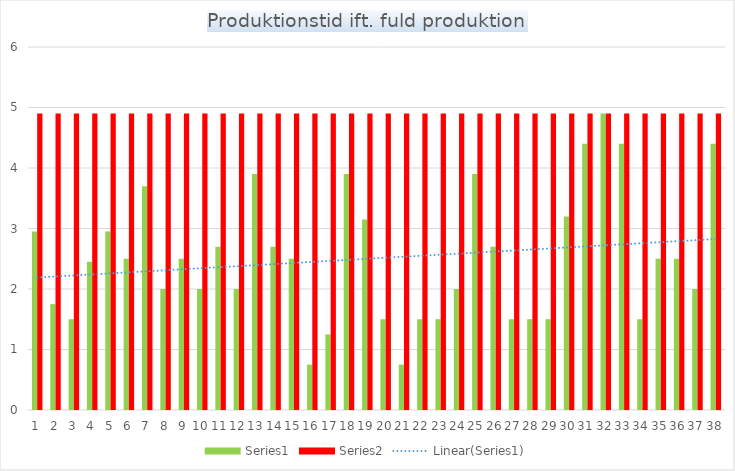
| Category | Series 0 | Series 1 |
|---|---|---|
| 0 | 2.95 | 4.9 |
| 1 | 1.75 | 4.9 |
| 2 | 1.5 | 4.9 |
| 3 | 2.45 | 4.9 |
| 4 | 2.95 | 4.9 |
| 5 | 2.5 | 4.9 |
| 6 | 3.7 | 4.9 |
| 7 | 2 | 4.9 |
| 8 | 2.5 | 4.9 |
| 9 | 2 | 4.9 |
| 10 | 2.7 | 4.9 |
| 11 | 2 | 4.9 |
| 12 | 3.9 | 4.9 |
| 13 | 2.7 | 4.9 |
| 14 | 2.5 | 4.9 |
| 15 | 0.75 | 4.9 |
| 16 | 1.25 | 4.9 |
| 17 | 3.9 | 4.9 |
| 18 | 3.15 | 4.9 |
| 19 | 1.5 | 4.9 |
| 20 | 0.75 | 4.9 |
| 21 | 1.5 | 4.9 |
| 22 | 1.5 | 4.9 |
| 23 | 2 | 4.9 |
| 24 | 3.9 | 4.9 |
| 25 | 2.7 | 4.9 |
| 26 | 1.5 | 4.9 |
| 27 | 1.5 | 4.9 |
| 28 | 1.5 | 4.9 |
| 29 | 3.2 | 4.9 |
| 30 | 4.4 | 4.9 |
| 31 | 4.9 | 4.9 |
| 32 | 4.4 | 4.9 |
| 33 | 1.5 | 4.9 |
| 34 | 2.5 | 4.9 |
| 35 | 2.5 | 4.9 |
| 36 | 2 | 4.9 |
| 37 | 4.4 | 4.9 |